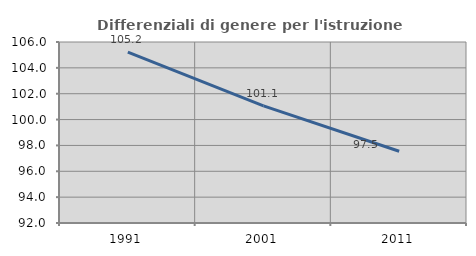
| Category | Differenziali di genere per l'istruzione superiore |
|---|---|
| 1991.0 | 105.217 |
| 2001.0 | 101.056 |
| 2011.0 | 97.548 |